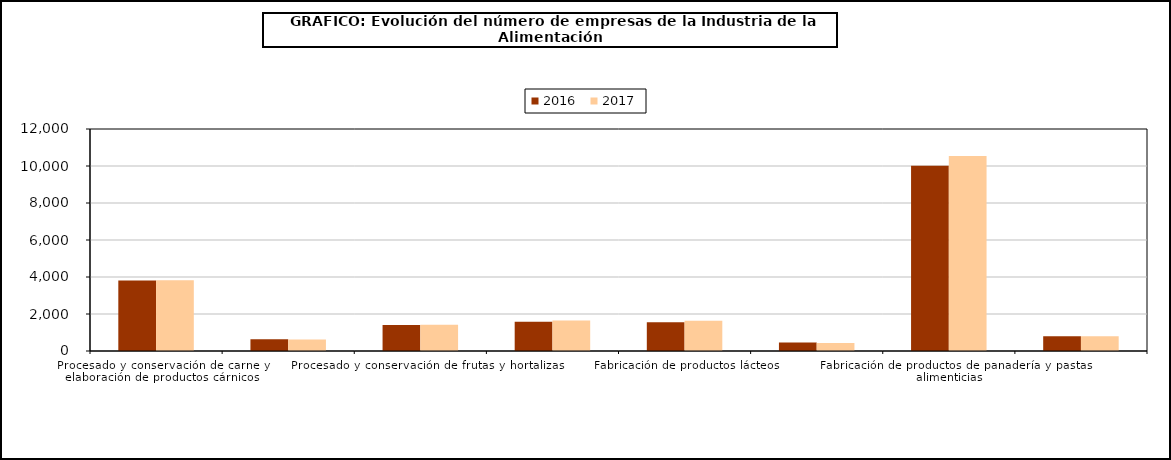
| Category | 2016 | 2017 |
|---|---|---|
| Procesado y conservación de carne y elaboración de productos cárnicos | 3810 | 3830 |
| Procesado y conservación de pescados, crustáceos y moluscos | 632 | 622 |
| Procesado y conservación de frutas y hortalizas | 1401 | 1423 |
| Fabricación de aceites y grasas vegetales y animales | 1577 | 1655 |
| Fabricación de productos lácteos | 1558 | 1641 |
| Fabricación de productos de molinería, almidones y productos amiláceos | 454 | 438 |
| Fabricación de productos de panadería y pastas alimenticias | 10009 | 10539 |
| Fabricación de productos para la alimentación animal | 793 | 798 |